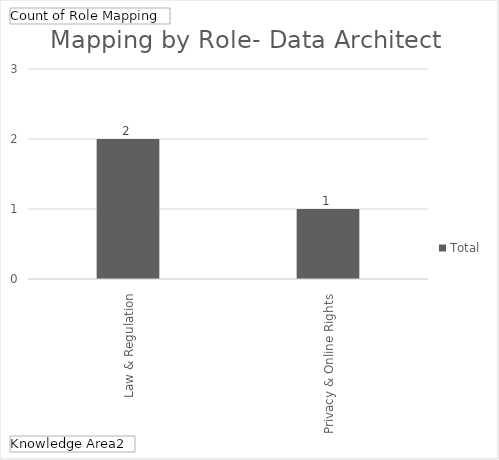
| Category | Total |
|---|---|
| Law & Regulation | 2 |
| Privacy & Online Rights | 1 |